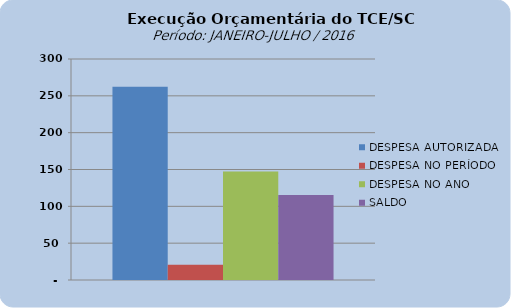
| Category | DESPESA AUTORIZADA | DESPESA NO PERÍODO | DESPESA NO ANO | SALDO |
|---|---|---|---|---|
| 0 | 262381702.23 | 20553621.11 | 147149385.45 | 115232316.78 |